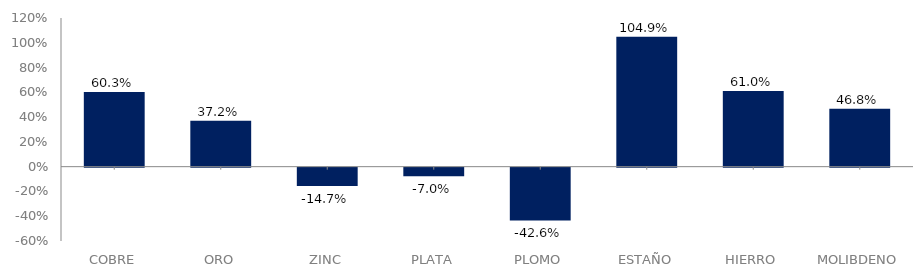
| Category | Series 0 |
|---|---|
| COBRE | 0.603 |
| ORO | 0.372 |
| ZINC | -0.147 |
| PLATA | -0.07 |
| PLOMO | -0.426 |
| ESTAÑO | 1.049 |
| HIERRO | 0.61 |
| MOLIBDENO | 0.468 |